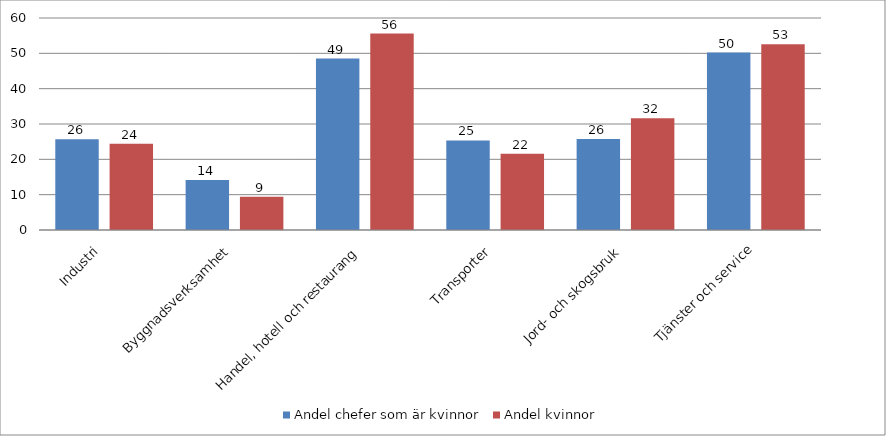
| Category | Andel chefer som är kvinnor | Andel kvinnor |
|---|---|---|
| Industri | 25.681 | 24.4 |
| Byggnadsverksamhet | 14.138 | 9.4 |
| Handel, hotell och restaurang | 48.534 | 55.6 |
| Transporter | 25.344 | 21.6 |
| Jord- och skogsbruk | 25.732 | 31.6 |
| Tjänster och service | 50.203 | 52.6 |